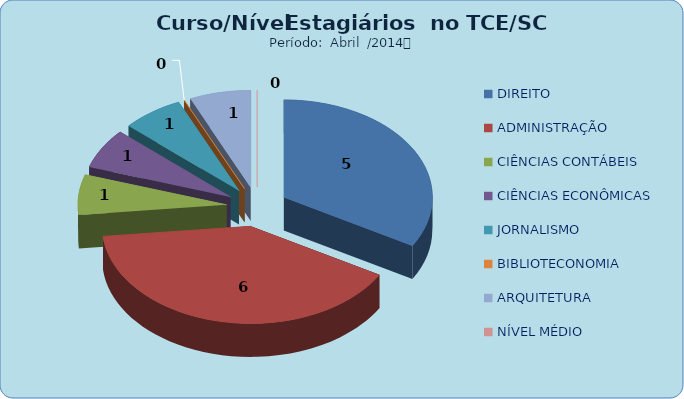
| Category | Series 0 |
|---|---|
| DIREITO | 5 |
| ADMINISTRAÇÃO | 6 |
| CIÊNCIAS CONTÁBEIS | 1 |
| CIÊNCIAS ECONÔMICAS | 1 |
| JORNALISMO | 1 |
| BIBLIOTECONOMIA | 0 |
| ARQUITETURA | 1 |
| NÍVEL MÉDIO | 0 |